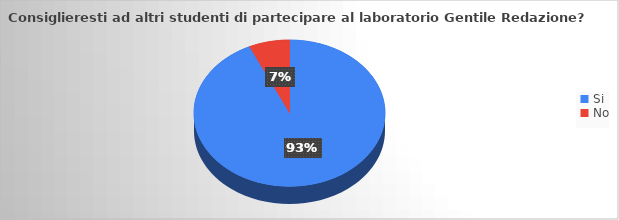
| Category | Series 0 |
|---|---|
| Si | 54 |
| No | 4 |